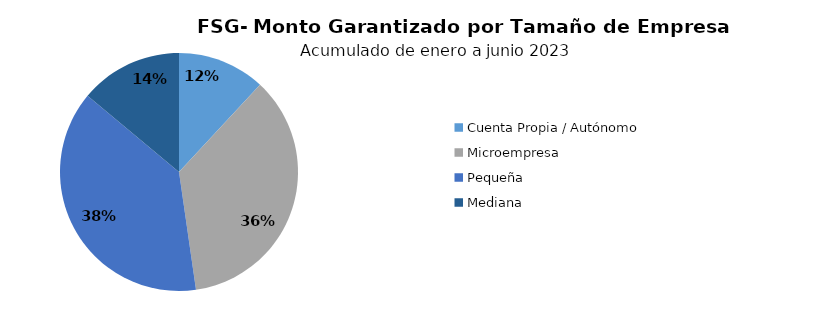
| Category | Monto |
|---|---|
| Cuenta Propia / Autónomo | 3.803 |
| Microempresa | 11.422 |
| Pequeña | 12.232 |
| Mediana | 4.449 |